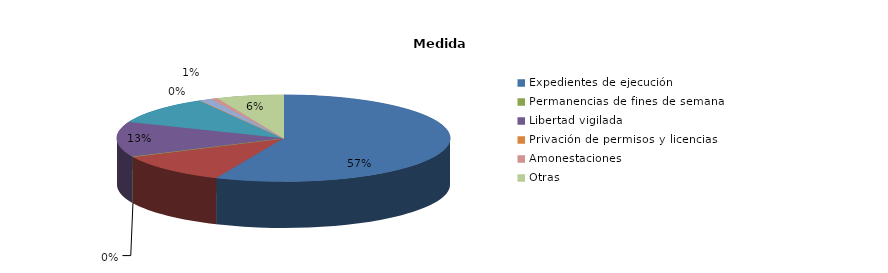
| Category | Series 0 |
|---|---|
| Expedientes de ejecución | 1040 |
| Internamientos | 209 |
| Permanencias de fines de semana | 1 |
| Libertad vigilada | 241 |
| Prestaciones en beneficio de la comunidad | 194 |
| Privación de permisos y licencias | 0 |
| Convivencia Familiar Educativa | 22 |
| Amonestaciones | 12 |
| Otras | 119 |